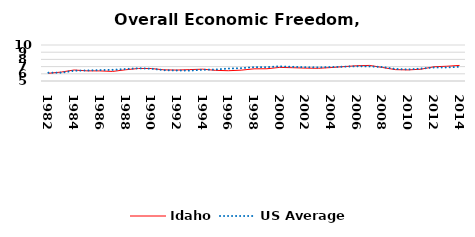
| Category | Idaho | US Average |
|---|---|---|
| 1982.0 | 6.069 | 6.149 |
| 1983.0 | 6.243 | 6.152 |
| 1984.0 | 6.527 | 6.429 |
| 1985.0 | 6.409 | 6.464 |
| 1986.0 | 6.4 | 6.512 |
| 1987.0 | 6.332 | 6.552 |
| 1988.0 | 6.558 | 6.659 |
| 1989.0 | 6.74 | 6.767 |
| 1990.0 | 6.734 | 6.71 |
| 1991.0 | 6.551 | 6.502 |
| 1992.0 | 6.519 | 6.463 |
| 1993.0 | 6.584 | 6.446 |
| 1994.0 | 6.642 | 6.563 |
| 1995.0 | 6.48 | 6.593 |
| 1996.0 | 6.429 | 6.73 |
| 1997.0 | 6.504 | 6.781 |
| 1998.0 | 6.689 | 6.926 |
| 1999.0 | 6.701 | 6.925 |
| 2000.0 | 6.889 | 7.031 |
| 2001.0 | 6.847 | 6.969 |
| 2002.0 | 6.791 | 6.912 |
| 2003.0 | 6.765 | 6.892 |
| 2004.0 | 6.867 | 6.934 |
| 2005.0 | 6.999 | 6.99 |
| 2006.0 | 7.122 | 7.048 |
| 2007.0 | 7.163 | 7.028 |
| 2008.0 | 6.877 | 6.935 |
| 2009.0 | 6.578 | 6.668 |
| 2010.0 | 6.541 | 6.605 |
| 2011.0 | 6.639 | 6.72 |
| 2012.0 | 6.973 | 6.883 |
| 2013.0 | 7.051 | 6.881 |
| 2014.0 | 7.164 | 6.973 |